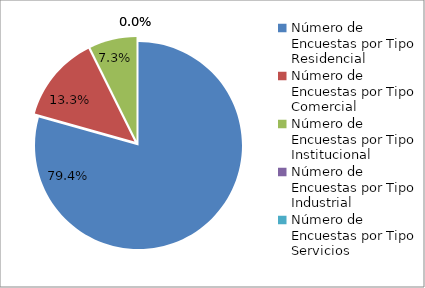
| Category | Series 0 |
|---|---|
| 0 | 173 |
| 1 | 29 |
| 2 | 16 |
| 3 | 0 |
| 4 | 0 |